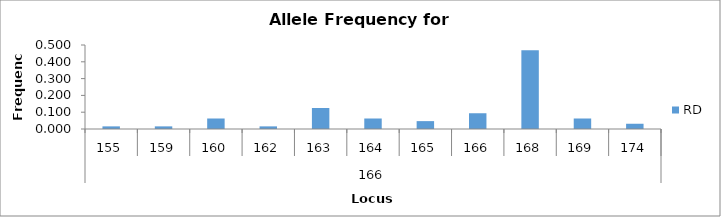
| Category | RD |
|---|---|
| 0 | 0.016 |
| 1 | 0.016 |
| 2 | 0.062 |
| 3 | 0.016 |
| 4 | 0.125 |
| 5 | 0.062 |
| 6 | 0.047 |
| 7 | 0.094 |
| 8 | 0.469 |
| 9 | 0.062 |
| 10 | 0.031 |